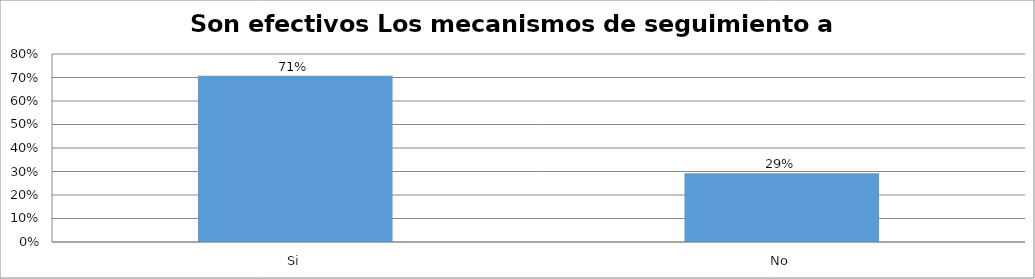
| Category | Series 0 |
|---|---|
| Si | 0.708 |
| No | 0.292 |